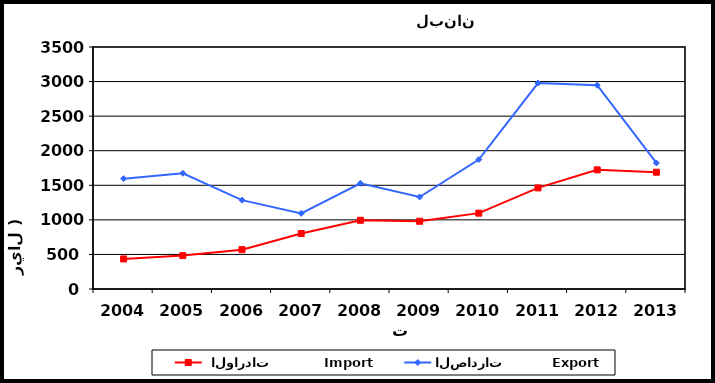
| Category |  الواردات           Import | الصادرات          Export |
|---|---|---|
| 2004.0 | 435 | 1596 |
| 2005.0 | 483 | 1674 |
| 2006.0 | 569 | 1285 |
| 2007.0 | 802 | 1094 |
| 2008.0 | 994 | 1528 |
| 2009.0 | 980 | 1331 |
| 2010.0 | 1097 | 1873 |
| 2011.0 | 1462 | 2979 |
| 2012.0 | 1723 | 2947 |
| 2013.0 | 1689 | 1823 |